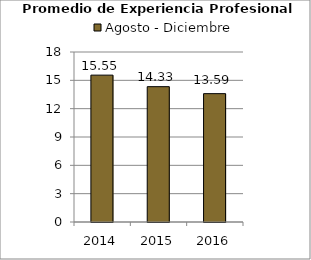
| Category | Agosto - Diciembre |
|---|---|
| 2014.0 | 15.55 |
| 2015.0 | 14.33 |
| 2016.0 | 13.59 |